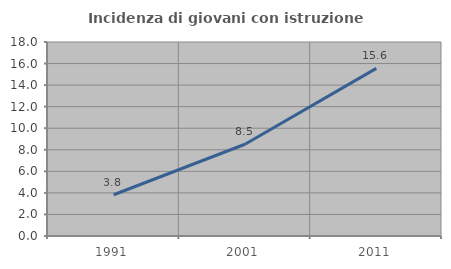
| Category | Incidenza di giovani con istruzione universitaria |
|---|---|
| 1991.0 | 3.827 |
| 2001.0 | 8.511 |
| 2011.0 | 15.551 |